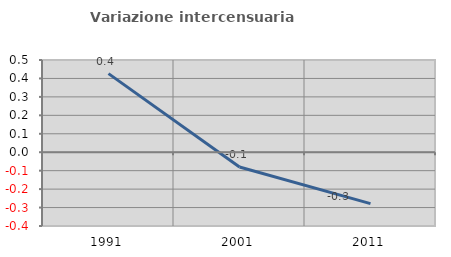
| Category | Variazione intercensuaria annua |
|---|---|
| 1991.0 | 0.426 |
| 2001.0 | -0.08 |
| 2011.0 | -0.279 |